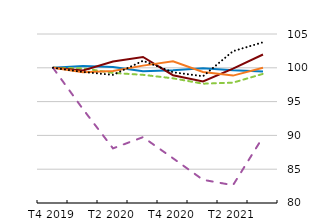
| Category | Chemicals and pharmaceuticals | Other manufacturing | Construction | Trade, repair of motor vehicles and motorcycles | Accommodation and food service activities | Other business sector services |
|---|---|---|---|---|---|---|
| T4 2019 | 100 | 100 | 100 | 100 | 100 | 100 |
| T1 2020 | 100.275 | 99.924 | 99.601 | 99.339 | 93.876 | 99.387 |
| T2 2020 | 100.108 | 99.24 | 100.923 | 99.529 | 88.079 | 98.951 |
| T3 2020 | 99.485 | 98.959 | 101.599 | 100.323 | 89.742 | 101.035 |
| T4 2020 | 99.643 | 98.446 | 98.903 | 100.956 | 86.616 | 99.342 |
| T1 2021 | 99.935 | 97.647 | 97.976 | 99.377 | 83.43 | 98.751 |
| T2 2021 | 99.632 | 97.804 | 99.87 | 98.846 | 82.633 | 102.457 |